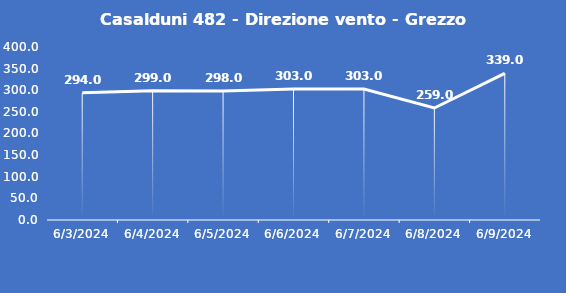
| Category | Casalduni 482 - Direzione vento - Grezzo (°N) |
|---|---|
| 6/3/24 | 294 |
| 6/4/24 | 299 |
| 6/5/24 | 298 |
| 6/6/24 | 303 |
| 6/7/24 | 303 |
| 6/8/24 | 259 |
| 6/9/24 | 339 |